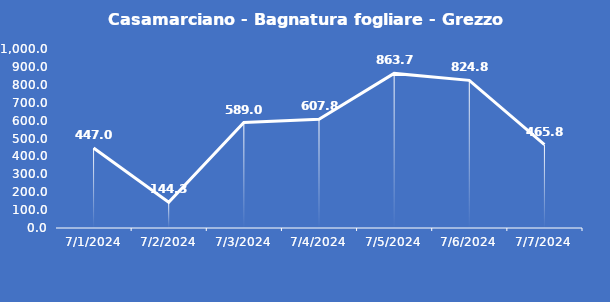
| Category | Casamarciano - Bagnatura fogliare - Grezzo (min) |
|---|---|
| 7/1/24 | 447 |
| 7/2/24 | 144.3 |
| 7/3/24 | 589 |
| 7/4/24 | 607.8 |
| 7/5/24 | 863.7 |
| 7/6/24 | 824.8 |
| 7/7/24 | 465.8 |